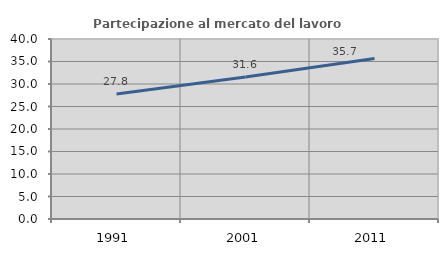
| Category | Partecipazione al mercato del lavoro  femminile |
|---|---|
| 1991.0 | 27.785 |
| 2001.0 | 31.579 |
| 2011.0 | 35.652 |